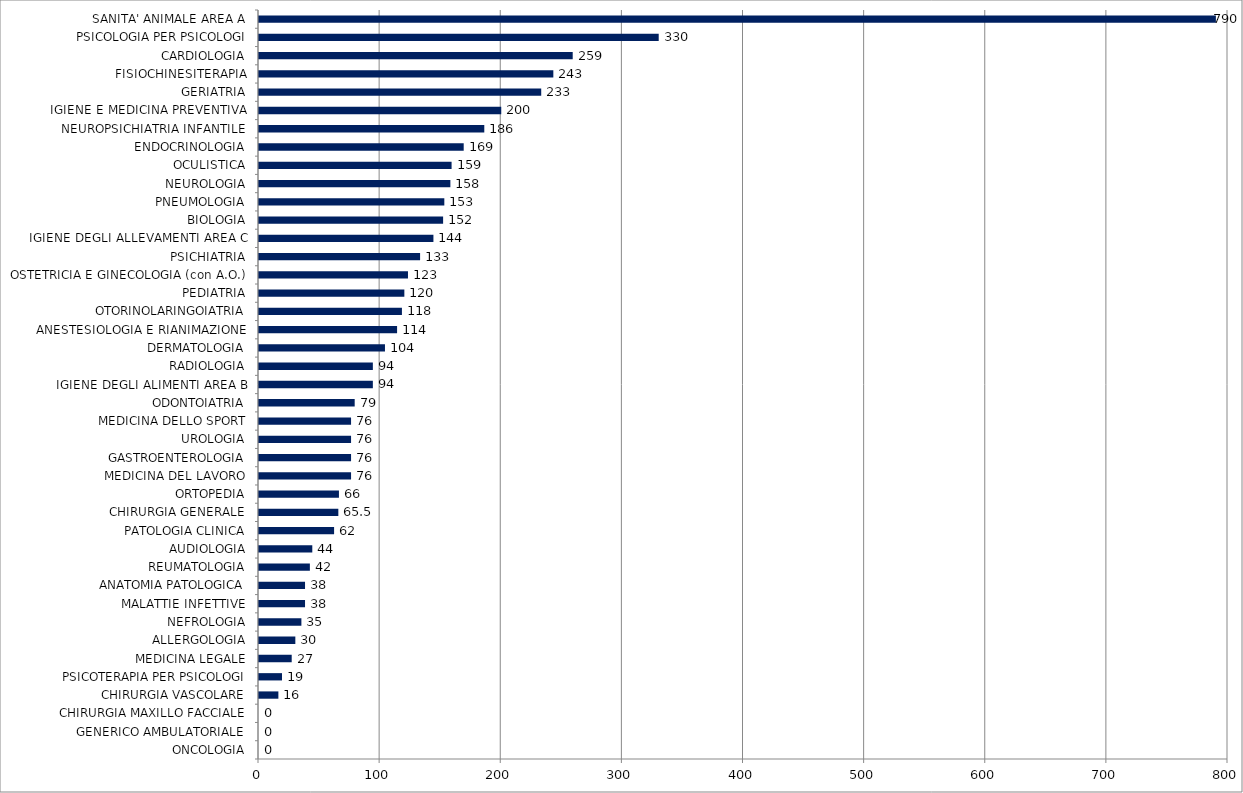
| Category | Series 0 |
|---|---|
| ONCOLOGIA | 0 |
| GENERICO AMBULATORIALE | 0 |
| CHIRURGIA MAXILLO FACCIALE | 0 |
| CHIRURGIA VASCOLARE | 16 |
| PSICOTERAPIA PER PSICOLOGI | 19 |
| MEDICINA LEGALE | 27 |
| ALLERGOLOGIA | 30 |
| NEFROLOGIA | 35 |
| MALATTIE INFETTIVE | 38 |
| ANATOMIA PATOLOGICA | 38 |
| REUMATOLOGIA | 42 |
| AUDIOLOGIA | 44 |
| PATOLOGIA CLINICA | 62 |
| CHIRURGIA GENERALE | 65.5 |
| ORTOPEDIA | 66 |
| MEDICINA DEL LAVORO | 76 |
| GASTROENTEROLOGIA | 76 |
| UROLOGIA | 76 |
| MEDICINA DELLO SPORT | 76 |
| ODONTOIATRIA | 79 |
| IGIENE DEGLI ALIMENTI AREA B | 94 |
| RADIOLOGIA | 94 |
| DERMATOLOGIA | 104 |
| ANESTESIOLOGIA E RIANIMAZIONE | 114 |
| OTORINOLARINGOIATRIA | 118 |
| PEDIATRIA | 120 |
| OSTETRICIA E GINECOLOGIA (con A.O.) | 123 |
| PSICHIATRIA | 133 |
| IGIENE DEGLI ALLEVAMENTI AREA C | 144 |
| BIOLOGIA | 152 |
| PNEUMOLOGIA | 153 |
| NEUROLOGIA | 158 |
| OCULISTICA | 159 |
| ENDOCRINOLOGIA | 169 |
| NEUROPSICHIATRIA INFANTILE | 186 |
| IGIENE E MEDICINA PREVENTIVA | 200 |
| GERIATRIA | 233 |
| FISIOCHINESITERAPIA | 243 |
| CARDIOLOGIA | 259 |
| PSICOLOGIA PER PSICOLOGI | 330 |
| SANITA' ANIMALE AREA A | 790 |